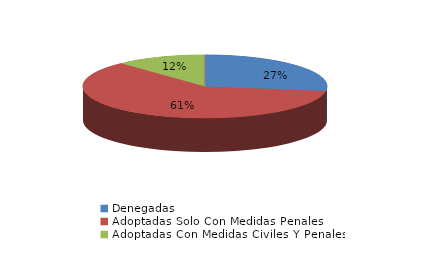
| Category | Series 0 |
|---|---|
| Denegadas | 46 |
| Adoptadas Solo Con Medidas Penales | 102 |
| Adoptadas Con Medidas Civiles Y Penales | 20 |
| Adoptadas Con Medidas Solo Civiles | 0 |